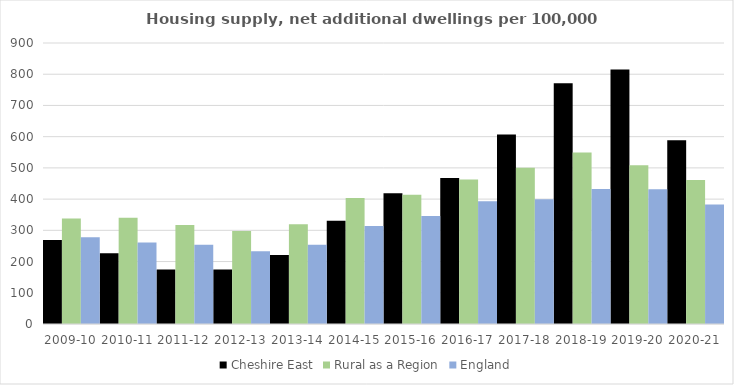
| Category | Cheshire East | Rural as a Region | England |
|---|---|---|---|
| 2009-10 | 269.222 | 337.852 | 277.548 |
| 2010-11 | 226.744 | 340.105 | 260.994 |
| 2011-12 | 174.518 | 317.04 | 254.007 |
| 2012-13 | 174.283 | 297.763 | 233.153 |
| 2013-14 | 221.176 | 319.835 | 253.602 |
| 2014-15 | 330.748 | 403.796 | 314.256 |
| 2015-16 | 418.661 | 414.091 | 346.154 |
| 2016-17 | 467.264 | 463.209 | 393.256 |
| 2017-18 | 606.579 | 500.68 | 399.646 |
| 2018-19 | 770.766 | 549.491 | 432.099 |
| 2019-20 | 815.042 | 508.493 | 431.187 |
| 2020-21 | 588.362 | 461.114 | 382.827 |